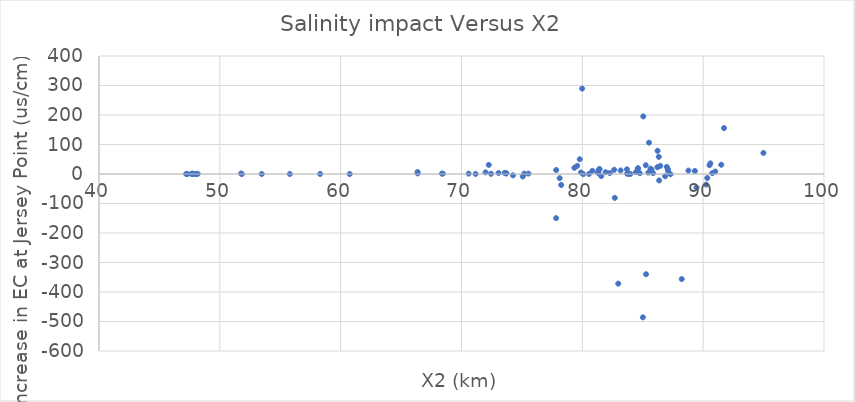
| Category | Series 0 |
|---|---|
| 73.568 | 3.462 |
| 82.689 | -80.917 |
| 84.436 | 6.16 |
| 81.291 | 3.83 |
| 82.636 | 14.203 |
| 71.99 | 5.604 |
| 73.711 | 2.544 |
| 71.169 | 0.147 |
| 94.987 | 71.423 |
| 75.069 | -8.475 |
| 88.782 | 11.628 |
| 68.379 | 1.19 |
| 90.339 | -13.439 |
| 83.847 | 0.612 |
| 91.724 | 155.614 |
| 90.752 | 2.868 |
| 86.209 | 22.955 |
| 83.701 | 0.912 |
| 55.795 | -0.007 |
| 72.441 | 0.598 |
| 83.978 | 0.18 |
| 78.251 | -37.185 |
| 77.83 | -149.481 |
| 86.36 | -21.821 |
| 80.835 | 10.812 |
| 75.541 | 1.355 |
| 85.273 | -339.748 |
| 48.168 | 0.587 |
| 85.464 | 4.749 |
| 84.595 | 18.593 |
| 86.448 | 27.485 |
| 82.973 | -371.649 |
| 90.596 | 36.143 |
| 85.248 | 29.795 |
| 79.985 | 289.511 |
| 85.044 | 195.201 |
| 47.714 | 1.681 |
| 86.987 | 24.102 |
| 87.082 | 16.152 |
| 89.446 | -45.931 |
| 83.168 | 11.972 |
| 81.929 | 6.171 |
| 90.249 | -36.014 |
| 72.26 | 30.853 |
| 68.459 | 1.191 |
| 79.575 | 27.527 |
| 85.718 | 15.04 |
| 79.347 | 21.043 |
| 77.837 | 13.54 |
| 86.225 | 78.614 |
| 51.757 | 1.772 |
| 87.301 | -0.843 |
| 88.226 | -356.193 |
| 81.566 | -6.848 |
| 86.327 | 58.257 |
| 47.68 | 0.069 |
| 80.549 | 0.164 |
| 60.75 | -0.016 |
| 70.592 | 1.22 |
| 85.01 | -485.968 |
| 78.127 | -14.147 |
| 48.013 | 0.042 |
| 82.27 | 3.244 |
| 84.614 | 19.541 |
| 73.696 | 1.623 |
| 79.884 | 5.212 |
| 91.5 | 31.348 |
| 48.055 | -0.065 |
| 81.398 | 16.382 |
| 47.779 | -0.002 |
| 66.364 | 6.798 |
| 47.335 | 0.042 |
| 79.786 | 50.035 |
| 66.372 | 1.909 |
| 73.064 | 3.273 |
| 81.422 | 16.295 |
| 83.693 | 15.964 |
| 85.645 | 18.177 |
| 89.318 | 10.212 |
| 85.854 | 2.834 |
| 58.298 | 0.107 |
| 84.757 | 2.714 |
| 86.853 | -7.491 |
| 75.194 | 1.313 |
| 53.471 | 0.025 |
| 80.072 | -0.443 |
| 47.208 | 0.057 |
| 85.515 | 106.203 |
| 51.827 | 0.047 |
| 74.262 | -4.462 |
| 87.081 | 11.264 |
| 81.324 | 8.576 |
| 90.527 | 29.711 |
| 90.998 | 8.303 |